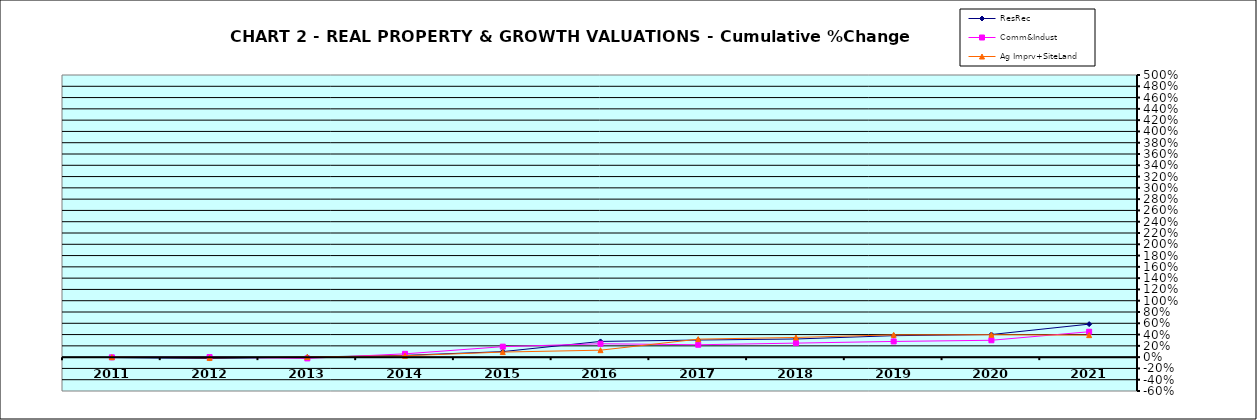
| Category | ResRec | Comm&Indust | Ag Imprv+SiteLand |
|---|---|---|---|
| 2011.0 | -0.008 | -0.003 | 0 |
| 2012.0 | -0.025 | 0.001 | -0.013 |
| 2013.0 | 0.002 | -0.022 | 0.003 |
| 2014.0 | 0.032 | 0.059 | 0.025 |
| 2015.0 | 0.098 | 0.186 | 0.09 |
| 2016.0 | 0.278 | 0.237 | 0.123 |
| 2017.0 | 0.303 | 0.219 | 0.319 |
| 2018.0 | 0.322 | 0.249 | 0.349 |
| 2019.0 | 0.38 | 0.278 | 0.395 |
| 2020.0 | 0.401 | 0.299 | 0.397 |
| 2021.0 | 0.585 | 0.45 | 0.39 |